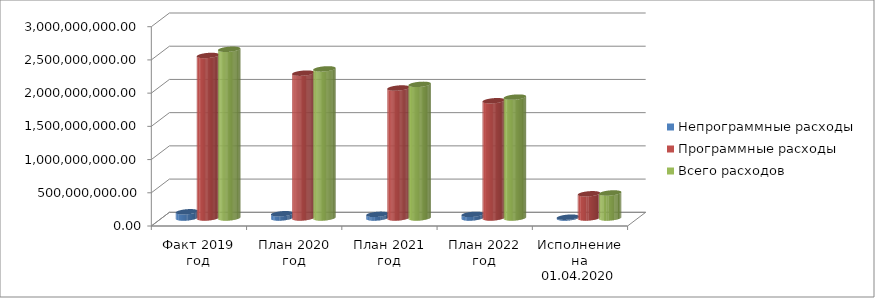
| Category | Непрограммные расходы | Программные расходы | Всего расходов |
|---|---|---|---|
| Факт 2019 год | 93276865.45 | 2446468858.11 | 2539745723.56 |
| План 2020 год | 64104357 | 2180252968.17 | 2244357325.17 |
| План 2021 год | 54948360 | 1956597506.74 | 2011545866.74 |
| План 2022 год | 54527060 | 1765063005.1 | 1819590065.1 |
| Исполнение на 01.04.2020 года | 12363704.48 | 364289205.06 | 376652909.54 |